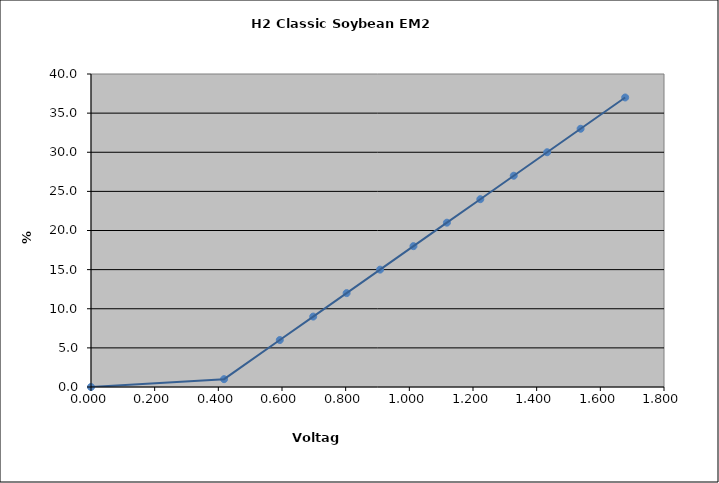
| Category | Generated Curve |
|---|---|
| 0.0 | 0 |
| 0.41800000000000004 | 1 |
| 0.593 | 6 |
| 0.698 | 9 |
| 0.8029999999999999 | 12 |
| 0.9079999999999999 | 15 |
| 1.013 | 18 |
| 1.1179999999999999 | 21 |
| 1.223 | 24 |
| 1.328 | 27 |
| 1.433 | 30 |
| 1.538 | 33 |
| 1.678 | 37 |